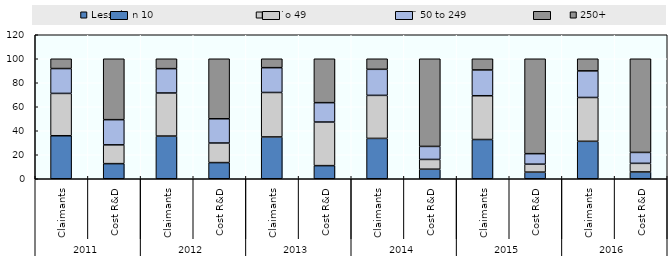
| Category | Less than 10 | 11 to 49 | 50 to 249 | 250+  |
|---|---|---|---|---|
| 0 | 35.841 | 35.273 | 20.724 | 8.162 |
| 1 | 12.595 | 15.649 | 20.992 | 50.763 |
| 2 | 35.58 | 35.904 | 20.285 | 8.231 |
| 3 | 13.475 | 16.312 | 20.213 | 50 |
| 4 | 34.835 | 37.056 | 20.685 | 7.424 |
| 5 | 10.926 | 36.342 | 16.152 | 36.58 |
| 6 | 33.631 | 35.86 | 21.72 | 8.79 |
| 7 | 7.957 | 8.137 | 10.85 | 73.056 |
| 8 | 32.704 | 36.482 | 21.498 | 9.316 |
| 9 | 5.508 | 6.638 | 8.757 | 79.096 |
| 10 | 31.208 | 36.521 | 22.178 | 10.093 |
| 11 | 5.672 | 7.164 | 9.104 | 78.06 |